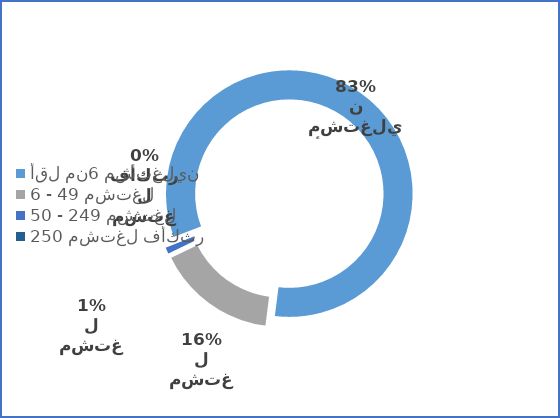
| Category | Series 0 |
|---|---|
| أقل من6 مشتغلين | 58169 |
| 6 - 49 مشتغل | 11138 |
| 50 - 249 مشتغل | 764 |
| 250 مشتغل فأكثر | 150 |